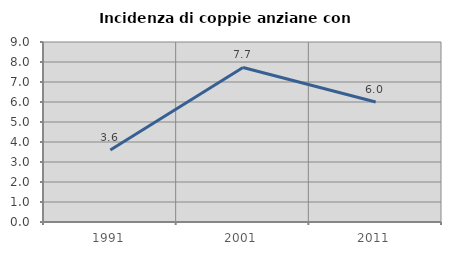
| Category | Incidenza di coppie anziane con figli |
|---|---|
| 1991.0 | 3.6 |
| 2001.0 | 7.727 |
| 2011.0 | 6.002 |